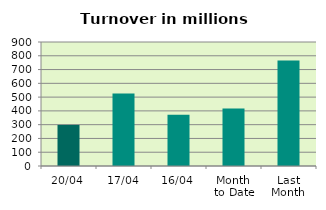
| Category | Series 0 |
|---|---|
| 20/04 | 298.432 |
| 17/04 | 526.261 |
| 16/04 | 371.845 |
| Month 
to Date | 417.402 |
| Last
Month | 765.33 |